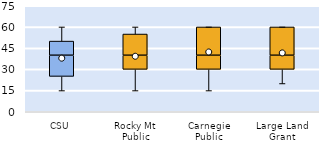
| Category | 25th | 50th | 75th |
|---|---|---|---|
| CSU | 25 | 15 | 10 |
| Rocky Mt Public | 30 | 10 | 15 |
| Carnegie Public | 30 | 10 | 20 |
| Large Land Grant | 30 | 10 | 20 |